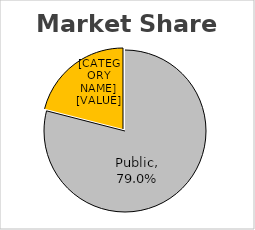
| Category | Amount |
|---|---|
| Public | 0.79 |
| Non Public | 0.21 |